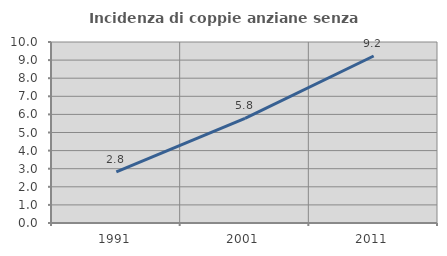
| Category | Incidenza di coppie anziane senza figli  |
|---|---|
| 1991.0 | 2.825 |
| 2001.0 | 5.781 |
| 2011.0 | 9.227 |